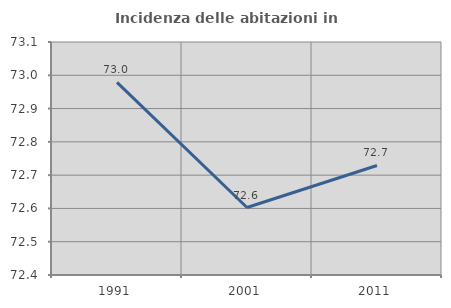
| Category | Incidenza delle abitazioni in proprietà  |
|---|---|
| 1991.0 | 72.979 |
| 2001.0 | 72.603 |
| 2011.0 | 72.729 |